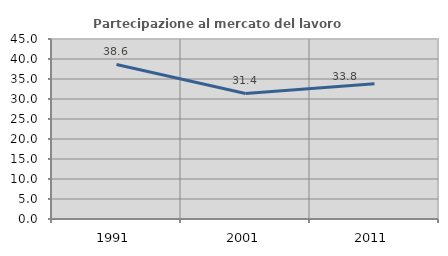
| Category | Partecipazione al mercato del lavoro  femminile |
|---|---|
| 1991.0 | 38.639 |
| 2001.0 | 31.377 |
| 2011.0 | 33.813 |